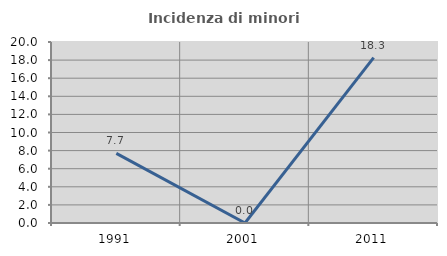
| Category | Incidenza di minori stranieri |
|---|---|
| 1991.0 | 7.692 |
| 2001.0 | 0 |
| 2011.0 | 18.269 |